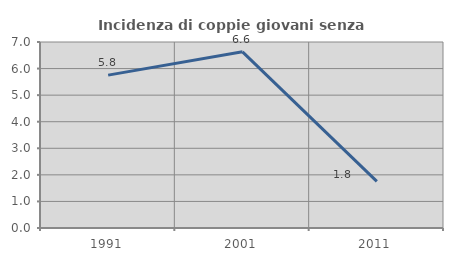
| Category | Incidenza di coppie giovani senza figli |
|---|---|
| 1991.0 | 5.753 |
| 2001.0 | 6.63 |
| 2011.0 | 1.754 |